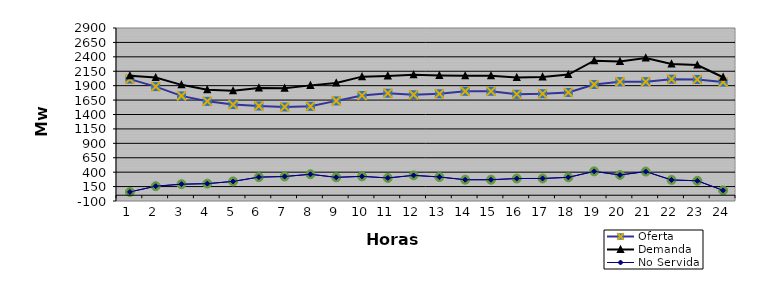
| Category | Oferta | No Servida | Demanda |
|---|---|---|---|
| 1.0 | 2013.63 | 57.2 | 2070.83 |
| 2.0 | 1884 | 156.61 | 2040.61 |
| 3.0 | 1723.07 | 191.28 | 1914.35 |
| 4.0 | 1628.4 | 200.78 | 1829.18 |
| 5.0 | 1571.77 | 239.69 | 1811.46 |
| 6.0 | 1547.12 | 313.79 | 1860.91 |
| 7.0 | 1530.95 | 324.8 | 1855.75 |
| 8.0 | 1541.69 | 363.27 | 1904.96 |
| 9.0 | 1636 | 310.36 | 1946.36 |
| 10.0 | 1729.13 | 327.24 | 2056.37 |
| 11.0 | 1768.99 | 299.77 | 2068.76 |
| 12.0 | 1742.88 | 344.67 | 2087.55 |
| 13.0 | 1759.1 | 316.51 | 2075.61 |
| 14.0 | 1802.09 | 268.64 | 2070.73 |
| 15.0 | 1802.82 | 268.82 | 2071.64 |
| 16.0 | 1750.89 | 289.68 | 2040.57 |
| 17.0 | 1760.4 | 290.75 | 2051.15 |
| 18.0 | 1782.21 | 310.05 | 2092.26 |
| 19.0 | 1920.54 | 413.47 | 2334.01 |
| 20.0 | 1969.2 | 351.39 | 2320.59 |
| 21.0 | 1969.32 | 409.94 | 2379.26 |
| 22.0 | 2011.72 | 265.24 | 2276.96 |
| 23.0 | 2006.73 | 250.37 | 2257.1 |
| 24.0 | 1961.99 | 84.25 | 2046.24 |